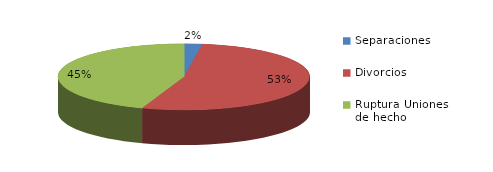
| Category | Series 0 |
|---|---|
| Separaciones | 17 |
| Divorcios | 391 |
| Ruptura Uniones de hecho | 329 |